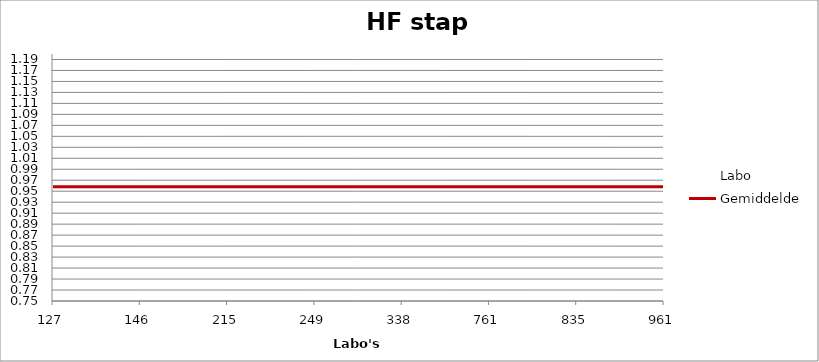
| Category | Labo | Gemiddelde |
|---|---|---|
| 127.0 | 0.998 | 0.958 |
| 146.0 | 0.945 | 0.958 |
| 215.0 | 1.031 | 0.958 |
| 249.0 | 0.765 | 0.958 |
| 338.0 | 1.098 | 0.958 |
| 761.0 | 1.164 | 0.958 |
| 835.0 | 0.898 | 0.958 |
| 961.0 | 0 | 0.958 |